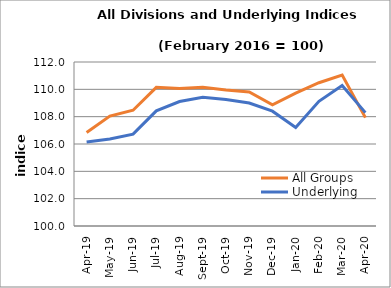
| Category | All Groups | Underlying |
|---|---|---|
| 2019-04-01 | 106.842 | 106.143 |
| 2019-05-01 | 108.044 | 106.37 |
| 2019-06-01 | 108.473 | 106.721 |
| 2019-07-01 | 110.146 | 108.423 |
| 2019-08-01 | 110.057 | 109.11 |
| 2019-09-01 | 110.148 | 109.423 |
| 2019-10-01 | 109.943 | 109.256 |
| 2019-11-01 | 109.811 | 108.998 |
| 2019-12-01 | 108.864 | 108.4 |
| 2020-01-01 | 109.718 | 107.211 |
| 2020-02-01 | 110.483 | 109.121 |
| 2020-03-01 | 111.043 | 110.276 |
| 2020-04-01 | 107.93 | 108.297 |